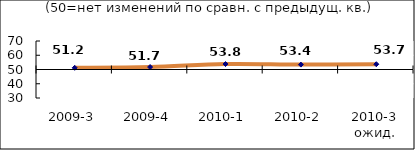
| Category | Диф.индекс ↓ |
|---|---|
| 2009-3 | 51.195 |
| 2009-4 | 51.725 |
| 2010-1 | 53.83 |
| 2010-2 | 53.44 |
| 2010-3 ожид. | 53.7 |